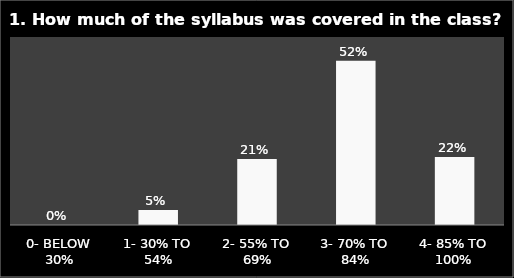
| Category | Series 0 |
|---|---|
| 0- BELOW 30% | 0 |
| 1- 30% TO 54% | 0.048 |
| 2- 55% TO 69% | 0.211 |
| 3- 70% TO 84% | 0.524 |
| 4- 85% TO 100% | 0.217 |